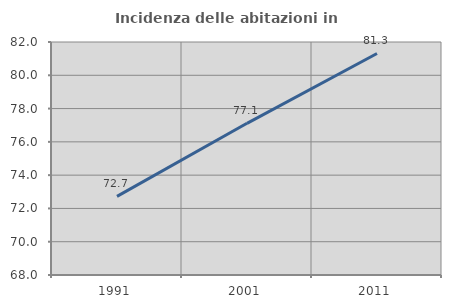
| Category | Incidenza delle abitazioni in proprietà  |
|---|---|
| 1991.0 | 72.727 |
| 2001.0 | 77.114 |
| 2011.0 | 81.311 |